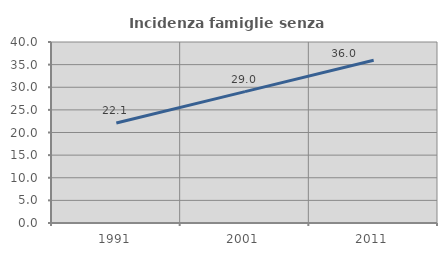
| Category | Incidenza famiglie senza nuclei |
|---|---|
| 1991.0 | 22.099 |
| 2001.0 | 29.026 |
| 2011.0 | 35.95 |